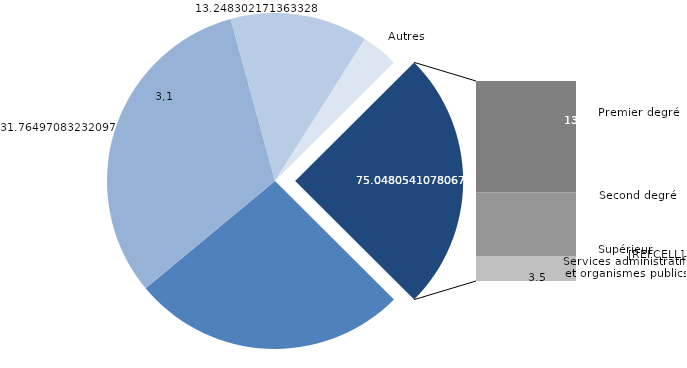
| Category | Series 0 |
|---|---|
| Établissements publics du premier degré | 40888.98 |
| Établissements publics du second degré | 49004.285 |
| Établissements publics du supérieur | 20438.35 |
| Autres établissements publics | 5446.116 |
| Établissements privés subventionnés | 21403.329 |
| Établissements privés non subventionnés | 12256.274 |
| Services administratifs et organismes publics | 4834.129 |